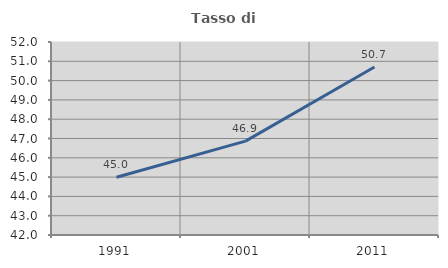
| Category | Tasso di occupazione   |
|---|---|
| 1991.0 | 44.991 |
| 2001.0 | 46.865 |
| 2011.0 | 50.704 |